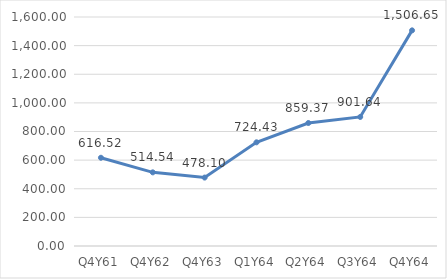
| Category | Series 0 |
|---|---|
| Q4Y61 | 616.52 |
| Q4Y62 | 514.54 |
| Q4Y63 | 478.1 |
| Q1Y64 | 724.43 |
| Q2Y64 | 859.37 |
| Q3Y64 | 901.64 |
| Q4Y64 | 1506.65 |